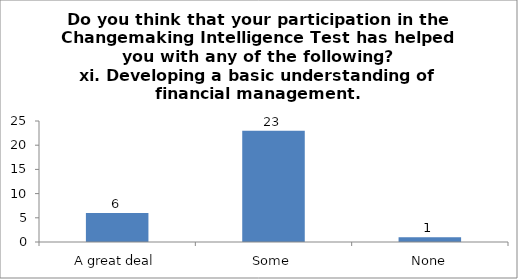
| Category | Do you think that your participation in the Changemaking Intelligence Test has helped you with any of the following?
xi. Developing a basic understanding of financial management. |
|---|---|
| A great deal | 6 |
| Some | 23 |
| None | 1 |